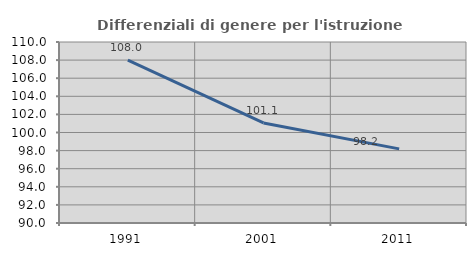
| Category | Differenziali di genere per l'istruzione superiore |
|---|---|
| 1991.0 | 108.009 |
| 2001.0 | 101.052 |
| 2011.0 | 98.19 |